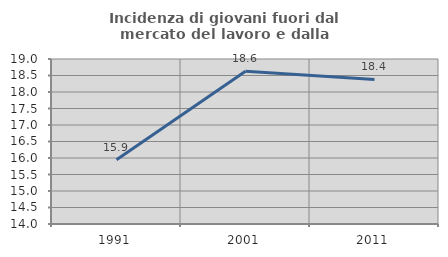
| Category | Incidenza di giovani fuori dal mercato del lavoro e dalla formazione  |
|---|---|
| 1991.0 | 15.95 |
| 2001.0 | 18.627 |
| 2011.0 | 18.379 |